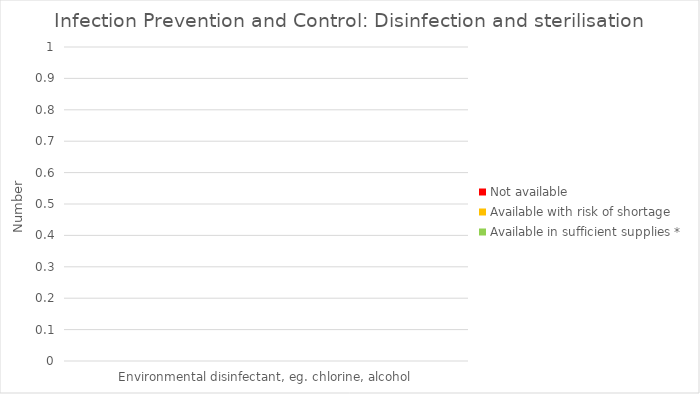
| Category | Available in sufficient supplies * | Available with risk of shortage | Not available |
|---|---|---|---|
| Environmental disinfectant, eg. chlorine, alcohol | 0 | 0 | 0 |